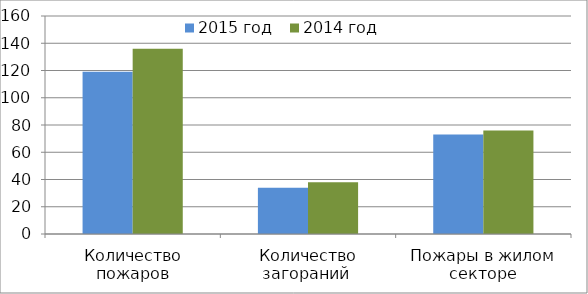
| Category | 2015 год | 2014 год |
|---|---|---|
| Количество пожаров | 119 | 136 |
| Количество загораний  | 34 | 38 |
| Пожары в жилом секторе | 73 | 76 |